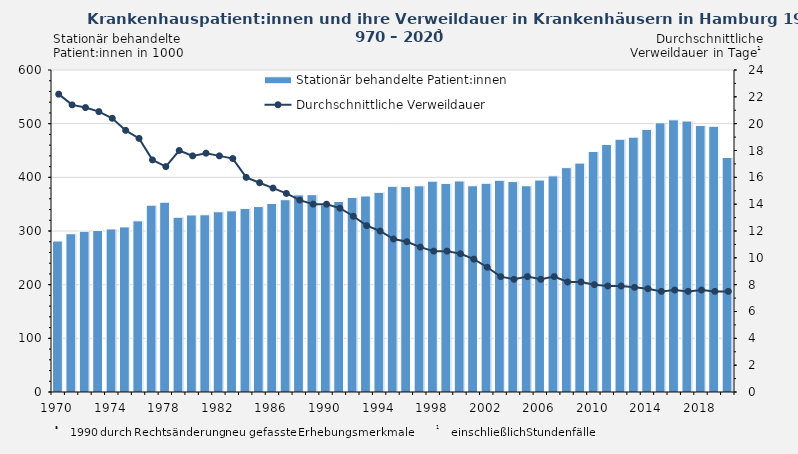
| Category | Stationär behandelte Patient:innen |
|---|---|
| 1970.0 | 281.312 |
| 1971.0 | 294.952 |
| 1972.0 | 299.555 |
| 1973.0 | 301.055 |
| 1974.0 | 303.829 |
| 1975.0 | 307.63 |
| 1976.0 | 318.934 |
| 1977.0 | 348.175 |
| 1978.0 | 353.637 |
| 1979.0 | 325.626 |
| 1980.0 | 329.893 |
| 1981.0 | 330.246 |
| 1982.0 | 335.871 |
| 1983.0 | 337.57 |
| 1984.0 | 341.85 |
| 1985.0 | 345.524 |
| 1986.0 | 351.37 |
| 1987.0 | 358.339 |
| 1988.0 | 367.336 |
| 1989.0 | 367.653 |
| 1990.0 | 348.744 |
| 1991.0 | 354.995 |
| 1992.0 | 362.481 |
| 1993.0 | 365.226 |
| 1994.0 | 372.023 |
| 1995.0 | 383.376 |
| 1996.0 | 382.688 |
| 1997.0 | 384.208 |
| 1998.0 | 392.887 |
| 1999.0 | 388.698 |
| 2000.0 | 393.274 |
| 2001.0 | 384.306 |
| 2002.0 | 388.926 |
| 2003.0 | 394.554 |
| 2004.0 | 392.057 |
| 2005.0 | 384.3 |
| 2006.0 | 394.933 |
| 2007.0 | 402.754 |
| 2008.0 | 418.109 |
| 2009.0 | 426.547 |
| 2010.0 | 448.176 |
| 2011.0 | 461.221 |
| 2012.0 | 471.009 |
| 2013.0 | 474.898 |
| 2014.0 | 489.391 |
| 2015.0 | 501.704 |
| 2016.0 | 507.159 |
| 2017.0 | 504.888 |
| 2018.0 | 496.708 |
| 2019.0 | 495.099 |
| 2020.0 | 437 |